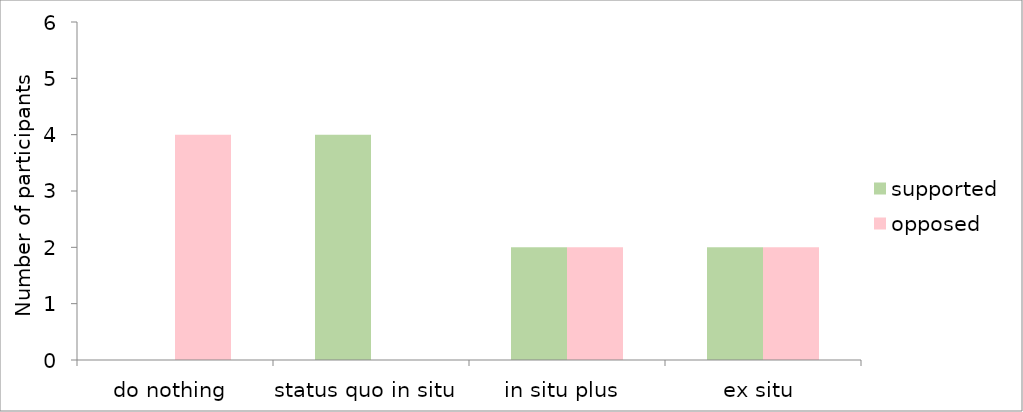
| Category | supported | opposed |
|---|---|---|
| do nothing | 0 | 4 |
| status quo in situ | 4 | 0 |
| in situ plus | 2 | 2 |
| ex situ | 2 | 2 |